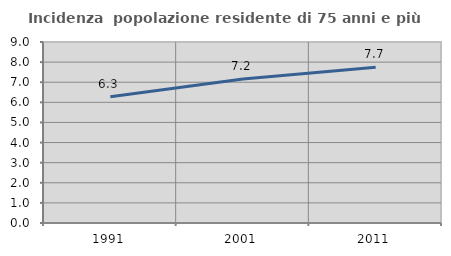
| Category | Incidenza  popolazione residente di 75 anni e più |
|---|---|
| 1991.0 | 6.275 |
| 2001.0 | 7.162 |
| 2011.0 | 7.748 |